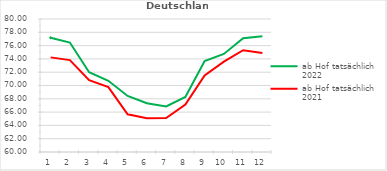
| Category | ab Hof tatsächlich 2022 | ab Hof tatsächlich 2021 |
|---|---|---|
| 0 | 77.178 | 74.23 |
| 1 | 76.455 | 73.819 |
| 2 | 71.997 | 70.79 |
| 3 | 70.708 | 69.753 |
| 4 | 68.43 | 65.676 |
| 5 | 67.339 | 65.061 |
| 6 | 66.849 | 65.096 |
| 7 | 68.289 | 67.125 |
| 8 | 73.686 | 71.496 |
| 9 | 74.744 | 73.584 |
| 10 | 77.104 | 75.299 |
| 11 | 77.389 | 74.895 |